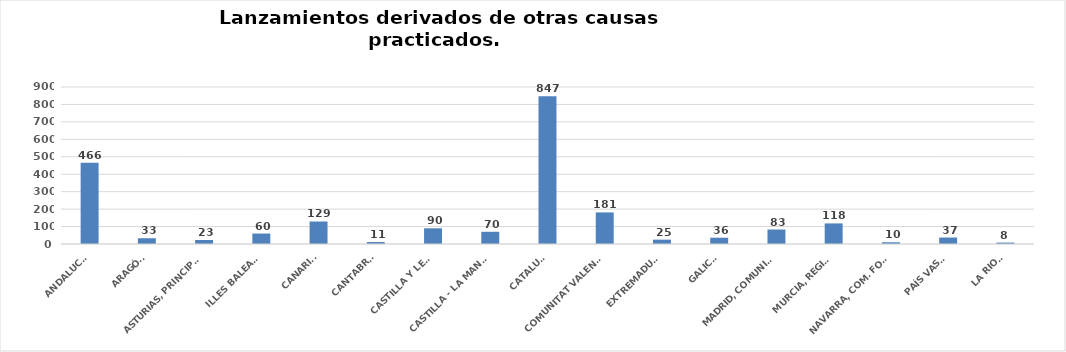
| Category | Series 0 |
|---|---|
| ANDALUCÍA | 466 |
| ARAGÓN | 33 |
| ASTURIAS, PRINCIPADO | 23 |
| ILLES BALEARS | 60 |
| CANARIAS | 129 |
| CANTABRIA | 11 |
| CASTILLA Y LEÓN | 90 |
| CASTILLA - LA MANCHA | 70 |
| CATALUÑA | 847 |
| COMUNITAT VALENCIANA | 181 |
| EXTREMADURA | 25 |
| GALICIA | 36 |
| MADRID, COMUNIDAD | 83 |
| MURCIA, REGIÓN | 118 |
| NAVARRA, COM. FORAL | 10 |
| PAÍS VASCO | 37 |
| LA RIOJA | 8 |